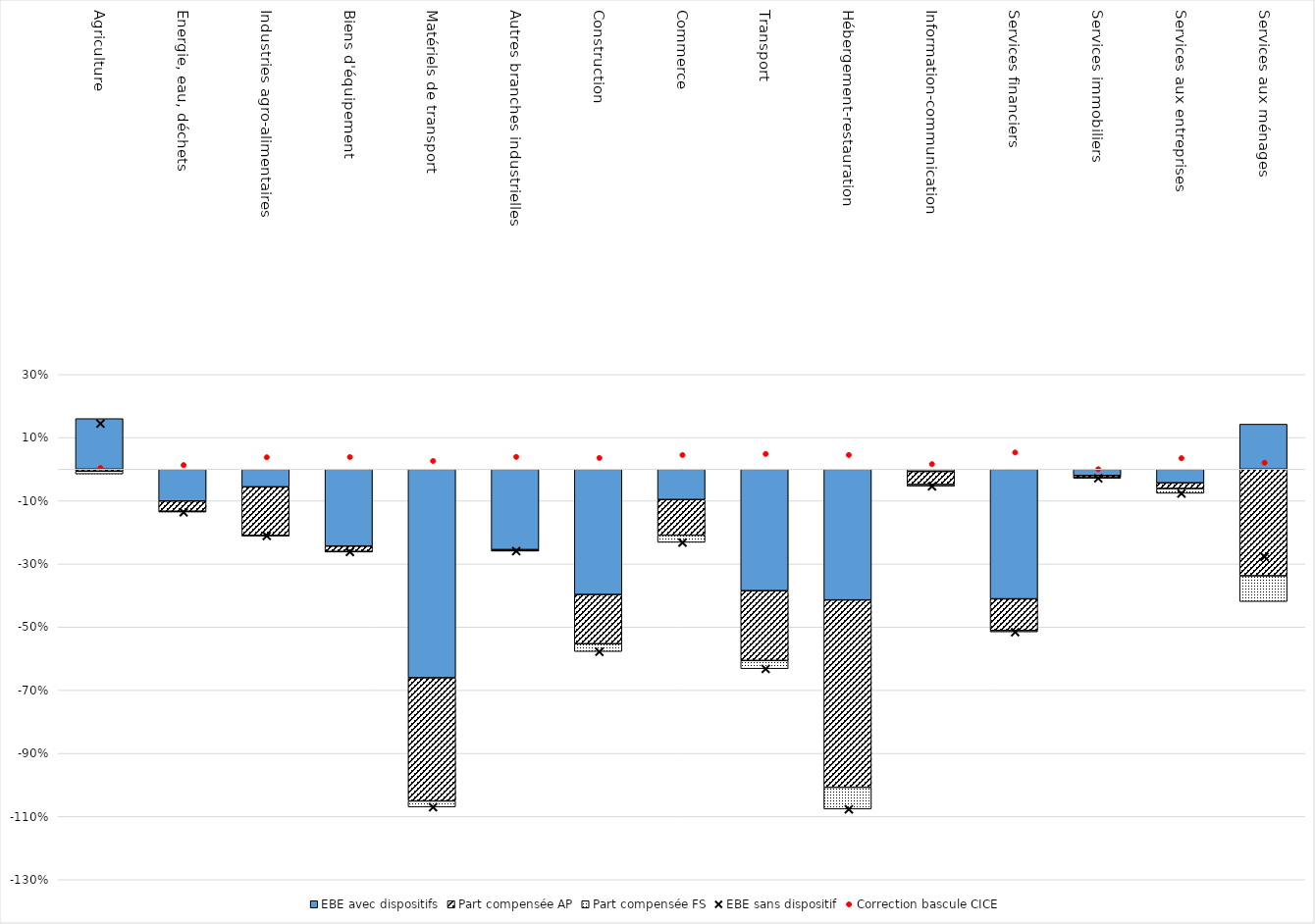
| Category | EBE avec dispositifs | Part compensée AP | Part compensée FS |
|---|---|---|---|
| Agriculture | 0.16 | -0.006 | -0.009 |
| Energie, eau, déchets | -0.101 | -0.032 | -0.003 |
| Industries agro-alimentaires | -0.056 | -0.154 | -0.001 |
| Biens d'équipement | -0.244 | -0.018 | 0 |
| Matériels de transport | -0.661 | -0.39 | -0.019 |
| Autres branches industrielles | -0.255 | -0.003 | 0 |
| Construction | -0.397 | -0.156 | -0.025 |
| Commerce | -0.096 | -0.113 | -0.023 |
| Transport | -0.385 | -0.221 | -0.026 |
| Hébergement-restauration | -0.414 | -0.593 | -0.069 |
| Information-communication | -0.007 | -0.041 | -0.005 |
| Services financiers | -0.411 | -0.1 | -0.004 |
| Services immobiliers | -0.02 | -0.007 | -0.001 |
| Services aux entreprises | -0.043 | -0.018 | -0.015 |
| Services aux ménages | 0.143 | -0.338 | -0.082 |